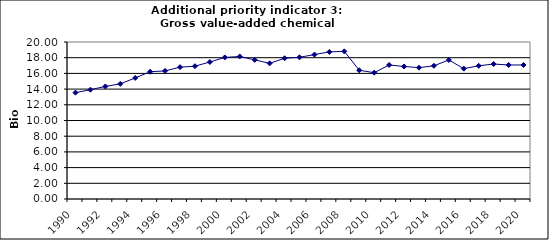
| Category | Gross value-added chemical industry, Bio Euro (EC95) |
|---|---|
| 1990 | 13.548 |
| 1991 | 13.926 |
| 1992 | 14.339 |
| 1993 | 14.665 |
| 1994 | 15.422 |
| 1995 | 16.213 |
| 1996 | 16.316 |
| 1997 | 16.797 |
| 1998 | 16.918 |
| 1999 | 17.45 |
| 2000 | 18.035 |
| 2001 | 18.155 |
| 2002 | 17.726 |
| 2003 | 17.279 |
| 2004 | 17.932 |
| 2005 | 18.052 |
| 2006 | 18.396 |
| 2007 | 18.74 |
| 2008 | 18.809 |
| 2009 | 16.402 |
| 2010 | 16.092 |
| 2011 | 17.072 |
| 2012 | 16.883 |
| 2013 | 16.728 |
| 2014 | 16.969 |
| 2015 | 17.708 |
| 2016 | 16.608 |
| 2017 | 16.969 |
| 2018 | 17.193 |
| 2019 | 17.072 |
| 2020 | 17.072 |